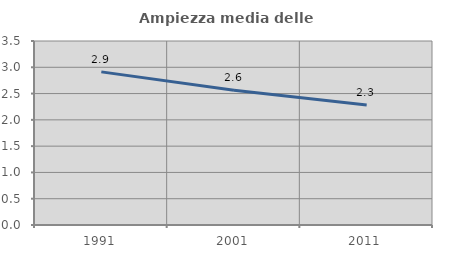
| Category | Ampiezza media delle famiglie |
|---|---|
| 1991.0 | 2.913 |
| 2001.0 | 2.562 |
| 2011.0 | 2.285 |